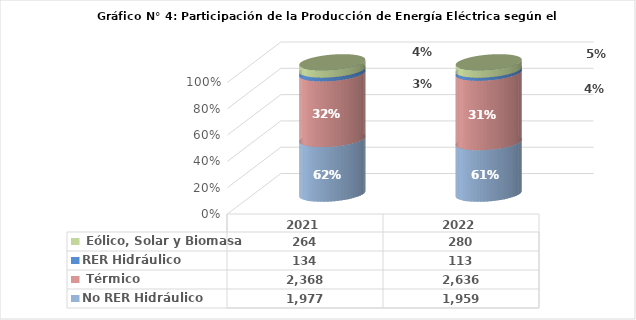
| Category | No RER Hidráulico | No RER Térmico | RER Hidráulico | RER Eólico, Solar y Biomasa |
|---|---|---|---|---|
| 2021.0 | 1976.992 | 2367.86 | 134.469 | 264.292 |
| 2022.0 | 1958.865 | 2635.571 | 113.352 | 280.154 |